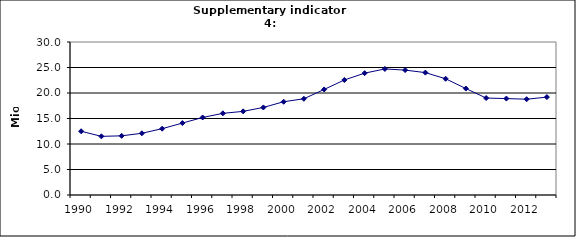
| Category | Domestic air-passengers, Mio |
|---|---|
| 1990 | 12.5 |
| 1991 | 11.5 |
| 1992 | 11.6 |
| 1993 | 12.1 |
| 1994 | 13 |
| 1995 | 14.1 |
| 1996 | 15.2 |
| 1997 | 16.013 |
| 1998 | 16.4 |
| 1999 | 17.17 |
| 2000 | 18.283 |
| 2001 | 18.867 |
| 2002 | 20.696 |
| 2003 | 22.553 |
| 2004 | 23.89 |
| 2005 | 24.719 |
| 2006 | 24.491 |
| 2007 | 23.997 |
| 2008 | 22.789 |
| 2009 | 20.87 |
| 2010 | 19.011 |
| 2011 | 18.909 |
| 2012 | 18.784 |
| 2013 | 19.192 |